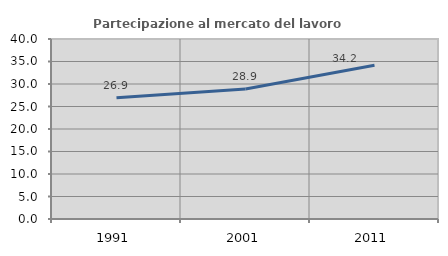
| Category | Partecipazione al mercato del lavoro  femminile |
|---|---|
| 1991.0 | 26.92 |
| 2001.0 | 28.909 |
| 2011.0 | 34.156 |